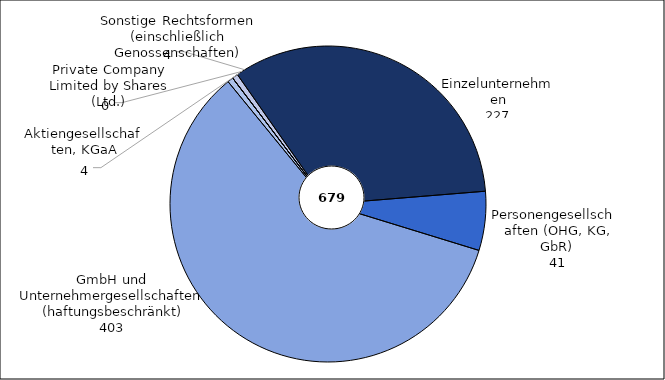
| Category | Series 0 |
|---|---|
| Einzelunternehmen | 227 |
| Personengesellschaften (OHG, KG, GbR) | 41 |
| Gesellschaften m.b.H. (einschließlich Unternehmergesellschaften (haftungsbeschränkt)) | 403 |
| Aktiengesellschaften, KGaA | 4 |
| Private Company Limited by Shares (Ltd.) | 0 |
| Sonstige Rechtsformen (einschließlich Genossenschaften) | 4 |